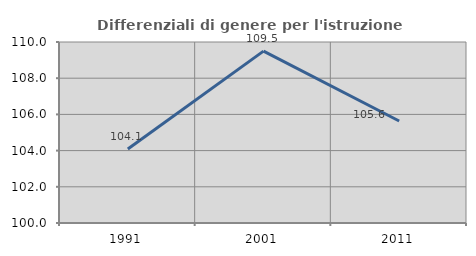
| Category | Differenziali di genere per l'istruzione superiore |
|---|---|
| 1991.0 | 104.093 |
| 2001.0 | 109.496 |
| 2011.0 | 105.633 |